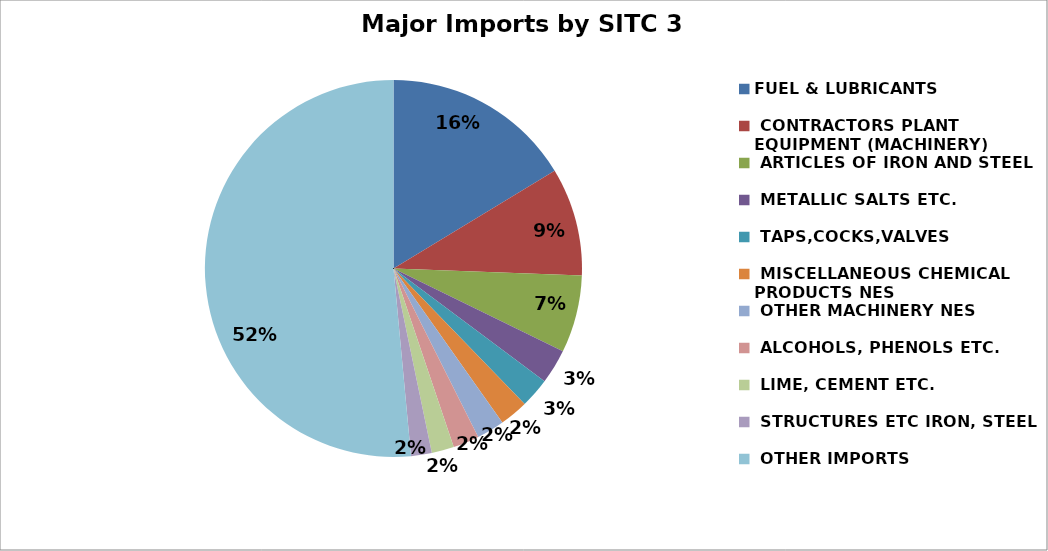
| Category | Series 0 |
|---|---|
| FUEL & LUBRICANTS  | 490696.882 |
|  CONTRACTORS PLANT EQUIPMENT (MACHINERY)  | 278650.811 |
|  ARTICLES OF IRON AND STEEL   | 200032.415 |
|  METALLIC SALTS ETC.  | 89509.024 |
|  TAPS,COCKS,VALVES  | 76482.724 |
|  MISCELLANEOUS CHEMICAL PRODUCTS NES  | 73628.023 |
|  OTHER MACHINERY NES  | 71518.752 |
|  ALCOHOLS, PHENOLS ETC.  | 67333.796 |
|  LIME, CEMENT ETC.  | 57646.245 |
|  STRUCTURES ETC IRON, STEEL  | 53441.754 |
|  OTHER IMPORTS  | 1548136.62 |